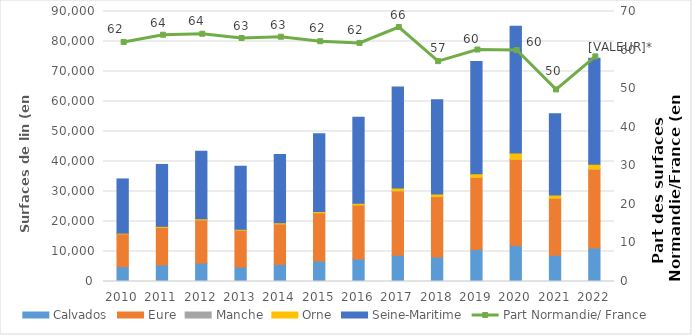
| Category | Calvados | Eure | Manche | Orne | Seine-Maritime |
|---|---|---|---|---|---|
| 2010.0 | 4911 | 10985 | 4 | 223 | 18065 |
| 2011.0 | 5520 | 12505 | 6 | 354 | 20635 |
| 2012.0 | 6150 | 14380 | 7 | 393 | 22478 |
| 2013.0 | 4805 | 12300 | 5 | 310 | 21000 |
| 2014.0 | 5700 | 13500 | 5 | 360 | 22800 |
| 2015.0 | 6800 | 16100 | 5 | 460 | 25900 |
| 2016.0 | 7500 | 18000 | 15 | 530 | 28700 |
| 2017.0 | 8730 | 21460 | 40 | 910 | 33670 |
| 2018.0 | 8140 | 20140 | 35 | 840 | 31420 |
| 2019.0 | 10660 | 24000 | 60 | 1175 | 37420 |
| 2020.0 | 11983 | 28672 | 90 | 2089 | 42288 |
| 2021.0 | 8750 | 18990 | 25 | 1090 | 27060 |
| 2022.0 | 11170 | 26230 | 60 | 1630 | 35330 |